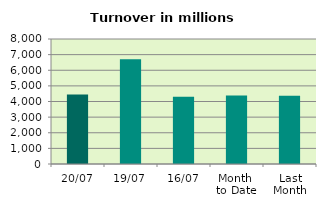
| Category | Series 0 |
|---|---|
| 20/07 | 4440.94 |
| 19/07 | 6706.046 |
| 16/07 | 4303.057 |
| Month 
to Date | 4379.164 |
| Last
Month | 4366.67 |